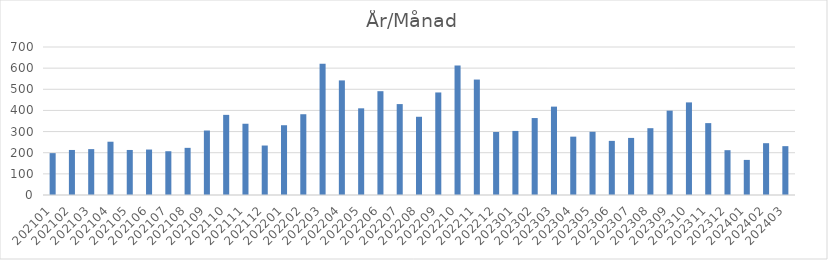
| Category | Summa |
|---|---|
| 202101 | 198 |
| 202102 | 213 |
| 202103 | 217 |
| 202104 | 252 |
| 202105 | 213 |
| 202106 | 215 |
| 202107 | 207 |
| 202108 | 223 |
| 202109 | 305 |
| 202110 | 379 |
| 202111 | 337 |
| 202112 | 234 |
| 202201 | 330 |
| 202202 | 382 |
| 202203 | 621 |
| 202204 | 542 |
| 202205 | 410 |
| 202206 | 491 |
| 202207 | 430 |
| 202208 | 370 |
| 202209 | 485 |
| 202210 | 612 |
| 202211 | 546 |
| 202212 | 298 |
| 202301 | 303 |
| 202302 | 364 |
| 202303 | 418 |
| 202304 | 276 |
| 202305 | 299 |
| 202306 | 256 |
| 202307 | 270 |
| 202308 | 316 |
| 202309 | 399 |
| 202310 | 438 |
| 202311 | 340 |
| 202312 | 212 |
| 202401 | 166 |
| 202402 | 245 |
| 202403 | 231 |